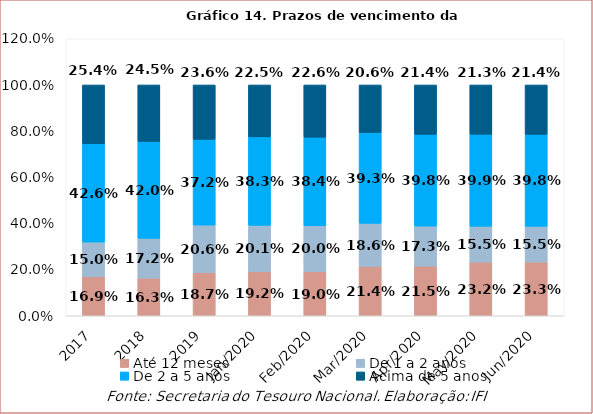
| Category | Até 12 meses | De 1 a 2 anos | De 2 a 5 anos | Acima de 5 anos |
|---|---|---|---|---|
| 2017.0 | 0.169 | 0.15 | 0.426 | 0.254 |
| 2018.0 | 0.163 | 0.172 | 0.42 | 0.245 |
| 2019.0 | 0.187 | 0.206 | 0.372 | 0.236 |
| 43831.0 | 0.192 | 0.201 | 0.383 | 0.225 |
| 43862.0 | 0.19 | 0.2 | 0.384 | 0.226 |
| 43891.0 | 0.214 | 0.186 | 0.393 | 0.206 |
| 43922.0 | 0.215 | 0.173 | 0.398 | 0.214 |
| 43952.0 | 0.232 | 0.155 | 0.399 | 0.213 |
| 43983.0 | 0.233 | 0.155 | 0.398 | 0.214 |